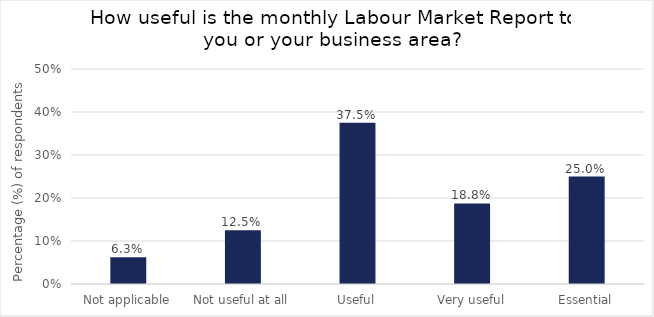
| Category | 6.3% |
|---|---|
| Not applicable | 0.062 |
| Not useful at all | 0.125 |
| Useful | 0.375 |
| Very useful | 0.188 |
| Essential | 0.25 |